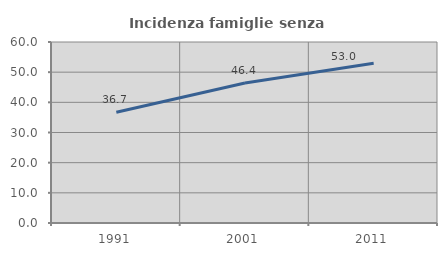
| Category | Incidenza famiglie senza nuclei |
|---|---|
| 1991.0 | 36.711 |
| 2001.0 | 46.421 |
| 2011.0 | 52.966 |